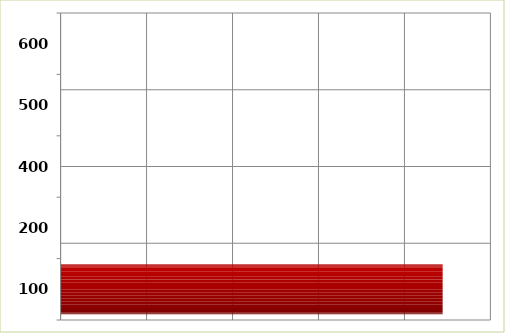
| Category | Series 0 |
|---|---|
| 100.0 | 4444230.75 |
| 200.0 | 0 |
| 400.0 | 0 |
| 500.0 | 0 |
| 600.0 | 0 |